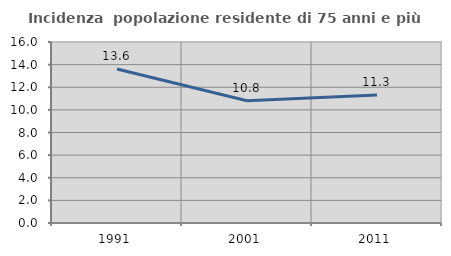
| Category | Incidenza  popolazione residente di 75 anni e più |
|---|---|
| 1991.0 | 13.62 |
| 2001.0 | 10.802 |
| 2011.0 | 11.321 |